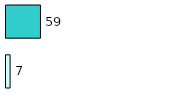
| Category | Series 0 | Series 1 |
|---|---|---|
| 0 | 7 | 59 |